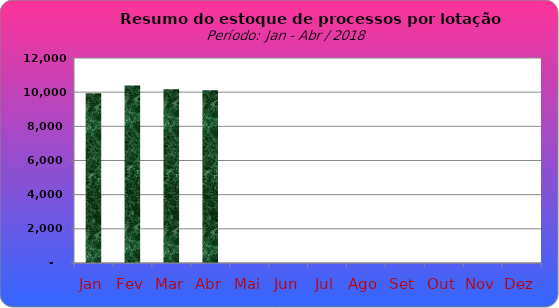
| Category | Series 0 |
|---|---|
| Jan | 9933 |
| Fev | 10393 |
| Mar | 10166 |
| Abr | 10112 |
| Mai | 0 |
| Jun | 0 |
| Jul | 0 |
| Ago | 0 |
| Set | 0 |
| Out | 0 |
| Nov | 0 |
| Dez | 0 |